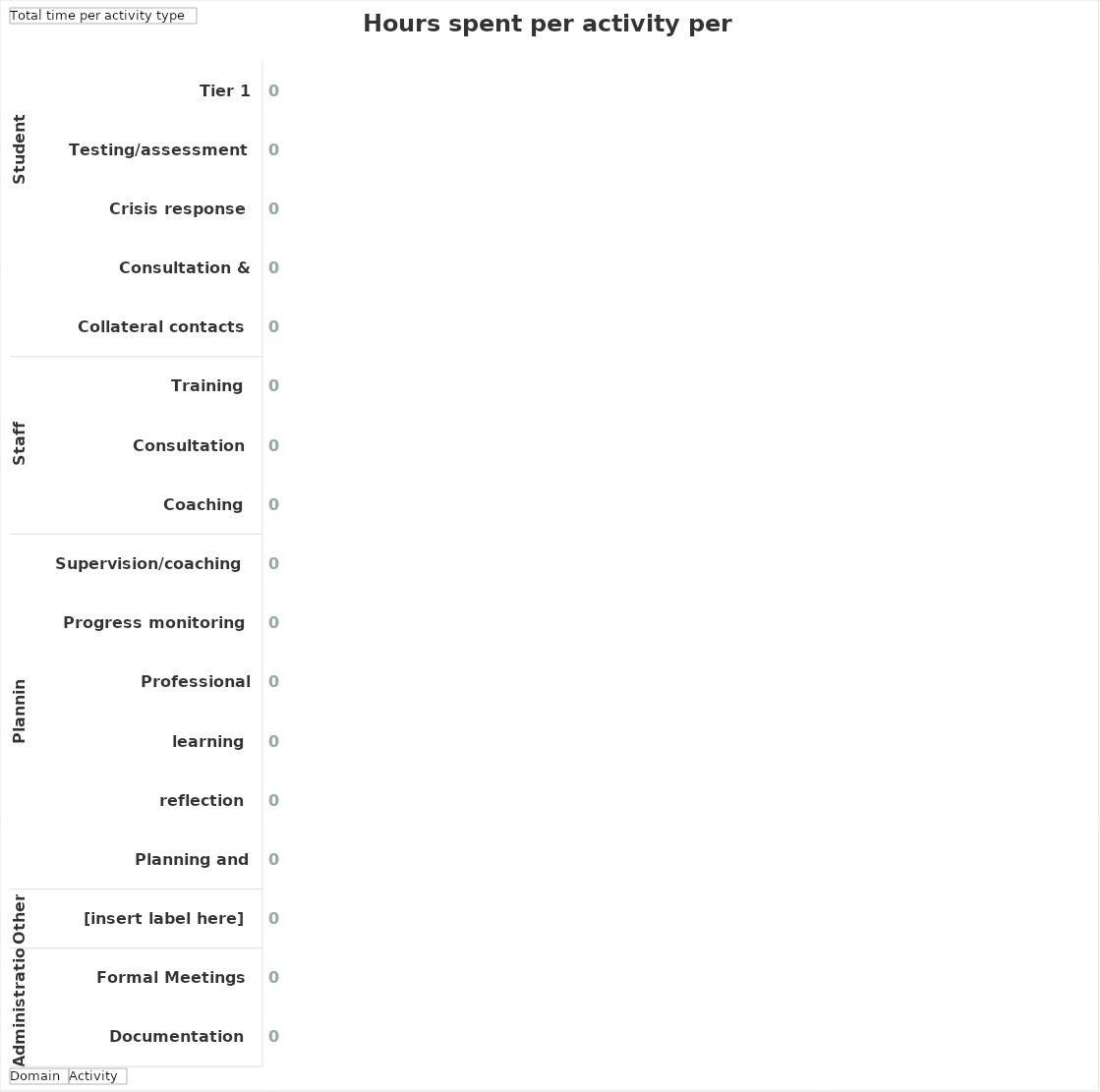
| Category | Total |
|---|---|
| 0 | 0 |
| 1 | 0 |
| 2 | 0 |
| 3 | 0 |
| 4 | 0 |
| 5 | 0 |
| 6 | 0 |
| 7 | 0 |
| 8 | 0 |
| 9 | 0 |
| 10 | 0 |
| 11 | 0 |
| 12 | 0 |
| 13 | 0 |
| 14 | 0 |
| 15 | 0 |
| 16 | 0 |